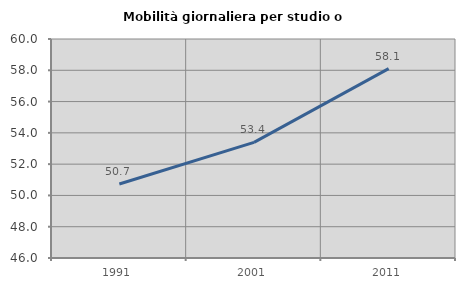
| Category | Mobilità giornaliera per studio o lavoro |
|---|---|
| 1991.0 | 50.727 |
| 2001.0 | 53.388 |
| 2011.0 | 58.106 |